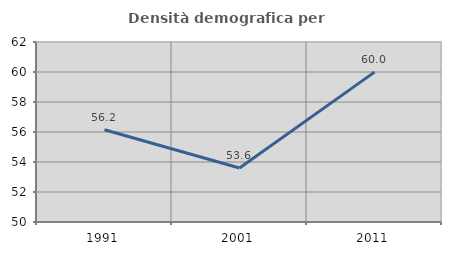
| Category | Densità demografica |
|---|---|
| 1991.0 | 56.154 |
| 2001.0 | 53.597 |
| 2011.0 | 59.991 |